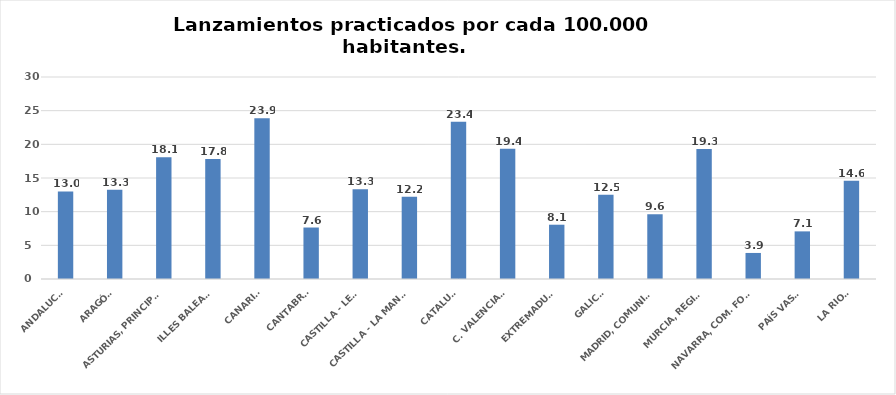
| Category | Series 0 |
|---|---|
| ANDALUCÍA | 13.013 |
| ARAGÓN | 13.266 |
| ASTURIAS, PRINCIPADO | 18.081 |
| ILLES BALEARS | 17.817 |
| CANARIAS | 23.86 |
| CANTABRIA | 7.646 |
| CASTILLA - LEÓN | 13.347 |
| CASTILLA - LA MANCHA | 12.208 |
| CATALUÑA | 23.37 |
| C. VALENCIANA | 19.355 |
| EXTREMADURA | 8.062 |
| GALICIA | 12.52 |
| MADRID, COMUNIDAD | 9.622 |
| MURCIA, REGIÓN | 19.321 |
| NAVARRA, COM. FORAL | 3.868 |
| PAÍS VASCO | 7.072 |
| LA RIOJA | 14.584 |